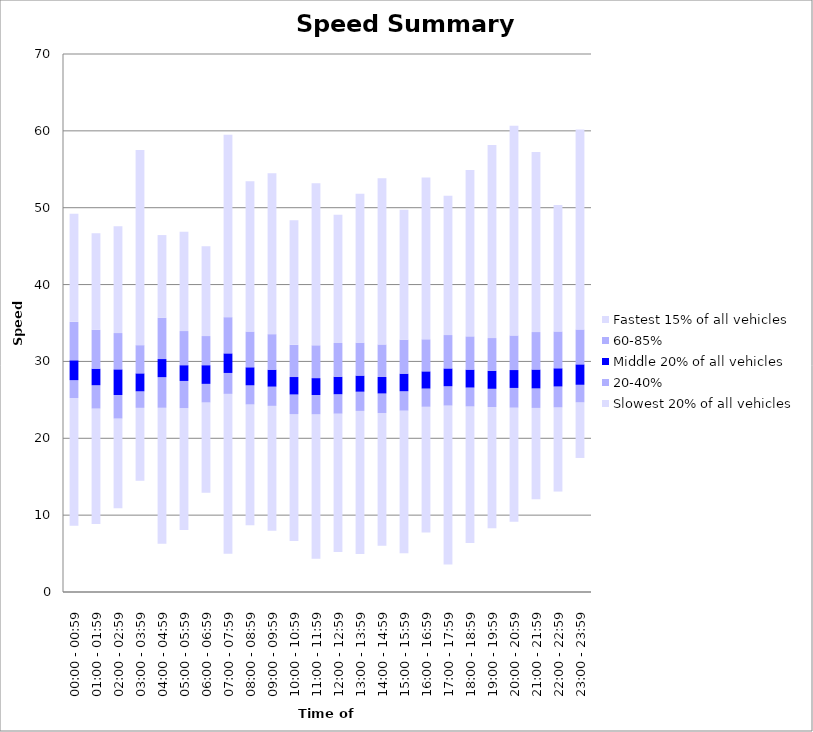
| Category | Series 0 | Slowest 20% of all vehicles | 20-40% | Middle 20% of all vehicles | 60-85% | Fastest 15% of all vehicles |
|---|---|---|---|---|---|---|
| 00:00 - 00:59 | 8.62 | 16.62 | 2.32 | 2.59 | 5 | 14.08 |
| 01:00 - 01:59 | 8.86 | 15.01 | 3.03 | 2.16 | 5.06 | 12.55 |
| 02:00 - 02:59 | 10.91 | 11.66 | 3.06 | 3.34 | 4.72 | 13.89 |
| 03:00 - 03:59 | 14.47 | 9.49 | 2.15 | 2.34 | 3.67 | 25.4 |
| 04:00 - 04:59 | 6.27 | 17.7 | 3.98 | 2.36 | 5.37 | 10.76 |
| 05:00 - 05:59 | 8.07 | 15.85 | 3.54 | 2.05 | 4.44 | 12.92 |
| 06:00 - 06:59 | 12.91 | 11.75 | 2.42 | 2.43 | 3.79 | 11.67 |
| 07:00 - 07:59 | 4.97 | 20.81 | 2.72 | 2.55 | 4.71 | 23.72 |
| 08:00 - 08:59 | 8.7 | 15.7 | 2.49 | 2.35 | 4.65 | 19.55 |
| 09:00 - 09:59 | 7.96 | 16.26 | 2.5 | 2.21 | 4.62 | 20.94 |
| 10:00 - 10:59 | 6.65 | 16.5 | 2.55 | 2.27 | 4.19 | 16.2 |
| 11:00 - 11:59 | 4.32 | 18.79 | 2.52 | 2.2 | 4.27 | 21.08 |
| 12:00 - 12:59 | 5.21 | 18 | 2.52 | 2.28 | 4.39 | 16.7 |
| 13:00 - 13:59 | 4.96 | 18.6 | 2.5 | 2.1 | 4.29 | 19.37 |
| 14:00 - 14:59 | 6.03 | 17.24 | 2.56 | 2.15 | 4.23 | 21.62 |
| 15:00 - 15:59 | 5.03 | 18.57 | 2.52 | 2.29 | 4.42 | 16.89 |
| 16:00 - 16:59 | 7.73 | 16.37 | 2.37 | 2.24 | 4.17 | 21.04 |
| 17:00 - 17:59 | 3.58 | 20.68 | 2.51 | 2.32 | 4.34 | 18.12 |
| 18:00 - 18:59 | 6.37 | 17.77 | 2.46 | 2.34 | 4.32 | 21.64 |
| 19:00 - 19:59 | 8.28 | 15.79 | 2.37 | 2.35 | 4.25 | 25.11 |
| 20:00 - 20:59 | 9.14 | 14.85 | 2.56 | 2.33 | 4.5 | 27.3 |
| 21:00 - 21:59 | 12.06 | 11.89 | 2.54 | 2.46 | 4.87 | 23.43 |
| 22:00 - 22:59 | 13.07 | 10.95 | 2.72 | 2.37 | 4.79 | 16.46 |
| 23:00 - 23:59 | 17.44 | 7.24 | 2.28 | 2.66 | 4.54 | 26.03 |